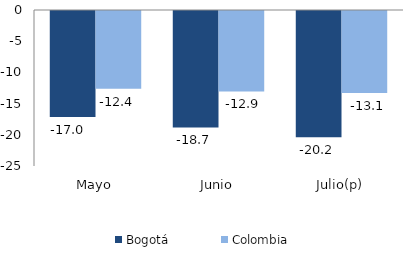
| Category | Bogotá | Colombia |
|---|---|---|
| Mayo | -16.976 | -12.449 |
| Junio | -18.656 | -12.9 |
| Julio(p) | -20.245 | -13.121 |